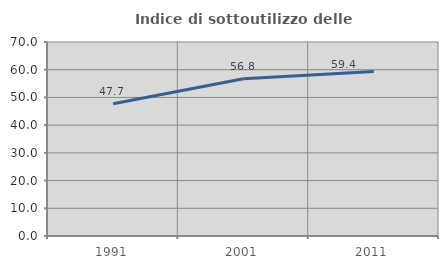
| Category | Indice di sottoutilizzo delle abitazioni  |
|---|---|
| 1991.0 | 47.73 |
| 2001.0 | 56.77 |
| 2011.0 | 59.368 |